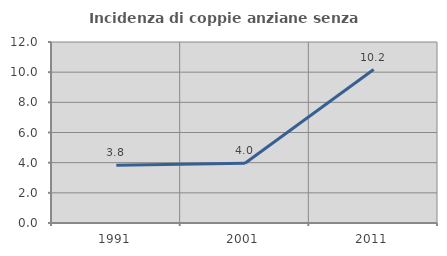
| Category | Incidenza di coppie anziane senza figli  |
|---|---|
| 1991.0 | 3.828 |
| 2001.0 | 3.96 |
| 2011.0 | 10.174 |